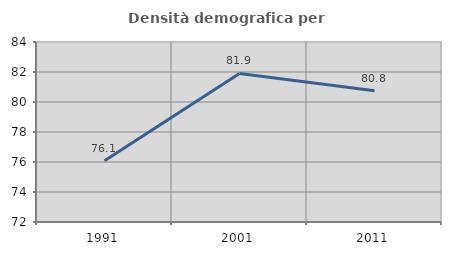
| Category | Densità demografica |
|---|---|
| 1991.0 | 76.086 |
| 2001.0 | 81.901 |
| 2011.0 | 80.755 |